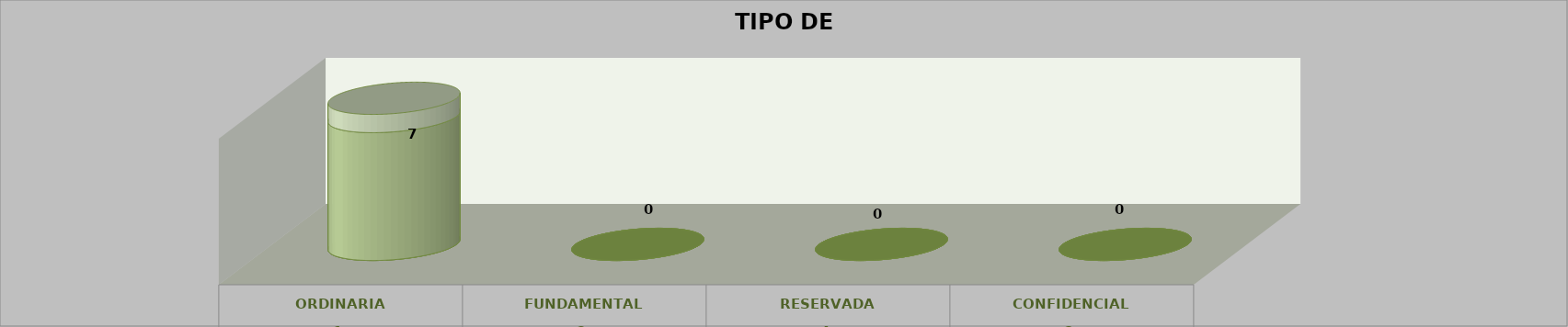
| Category | Series 0 | Series 2 | Series 1 | Series 3 | Series 4 |
|---|---|---|---|---|---|
| 0 |  |  |  | 7 | 1 |
| 1 |  |  |  | 0 | 0 |
| 2 |  |  |  | 0 | 0 |
| 3 |  |  |  | 0 | 0 |